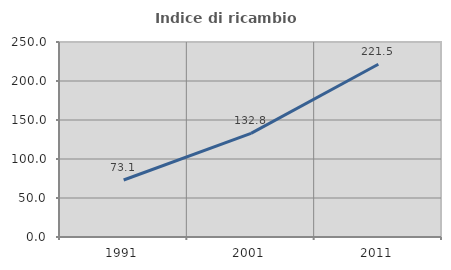
| Category | Indice di ricambio occupazionale  |
|---|---|
| 1991.0 | 73.077 |
| 2001.0 | 132.773 |
| 2011.0 | 221.505 |